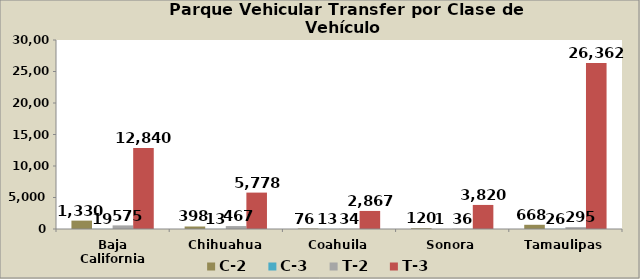
| Category | C-2 | C-3 | T-2 | T-3 | S-2 |
|---|---|---|---|---|---|
| Baja California | 1330 | 19 | 575 | 12840 |  |
| Chihuahua | 398 | 13 | 467 | 5778 |  |
| Coahuila | 76 | 13 | 34 | 2867 |  |
| Sonora | 120 | 1 | 36 | 3820 |  |
| Tamaulipas | 668 | 26 | 295 | 26362 |  |